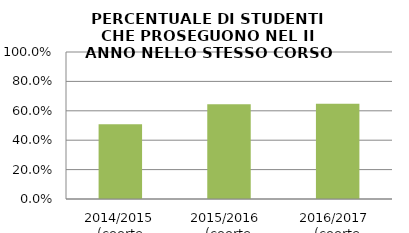
| Category | 2014/2015 (coorte 2013/14) 2015/2016  (coorte 2014/15) 2016/2017  (coorte 2015/16) |
|---|---|
| 2014/2015 (coorte 2013/14) | 0.508 |
| 2015/2016  (coorte 2014/15) | 0.644 |
| 2016/2017  (coorte 2015/16) | 0.648 |